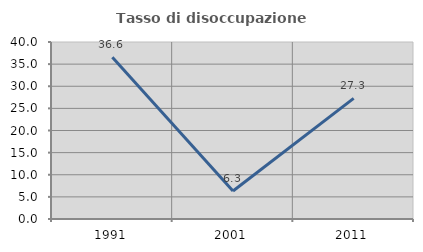
| Category | Tasso di disoccupazione giovanile  |
|---|---|
| 1991.0 | 36.567 |
| 2001.0 | 6.329 |
| 2011.0 | 27.273 |